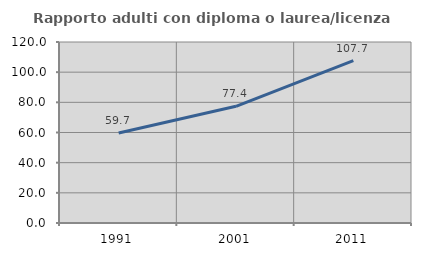
| Category | Rapporto adulti con diploma o laurea/licenza media  |
|---|---|
| 1991.0 | 59.677 |
| 2001.0 | 77.386 |
| 2011.0 | 107.708 |